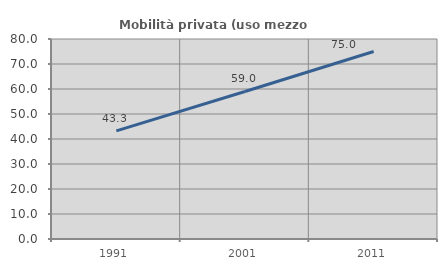
| Category | Mobilità privata (uso mezzo privato) |
|---|---|
| 1991.0 | 43.268 |
| 2001.0 | 59.013 |
| 2011.0 | 75 |